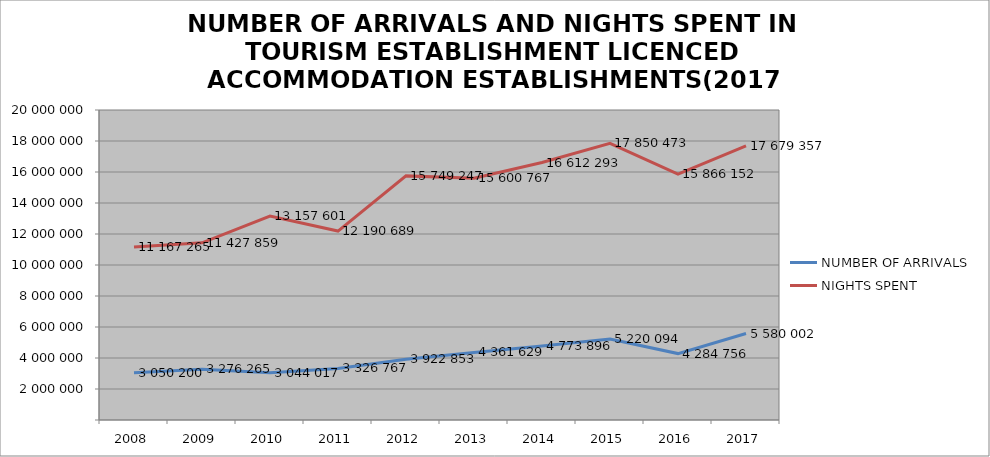
| Category | NUMBER OF ARRIVALS | NIGHTS SPENT |
|---|---|---|
| 2008 | 3050200 | 11167265 |
| 2009 | 3276265 | 11427859 |
| 2010 | 3044017 | 13157601 |
| 2011 | 3326767 | 12190689 |
| 2012 | 3922853 | 15749247 |
| 2013 | 4361629 | 15600767 |
| 2014 | 4773896 | 16612293 |
| 2015 | 5220094 | 17850473 |
| 2016 | 4284756 | 15866152 |
| 2017 | 5580002 | 17679357 |